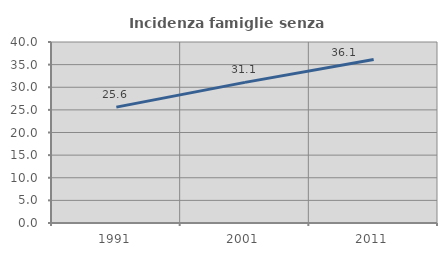
| Category | Incidenza famiglie senza nuclei |
|---|---|
| 1991.0 | 25.607 |
| 2001.0 | 31.081 |
| 2011.0 | 36.111 |